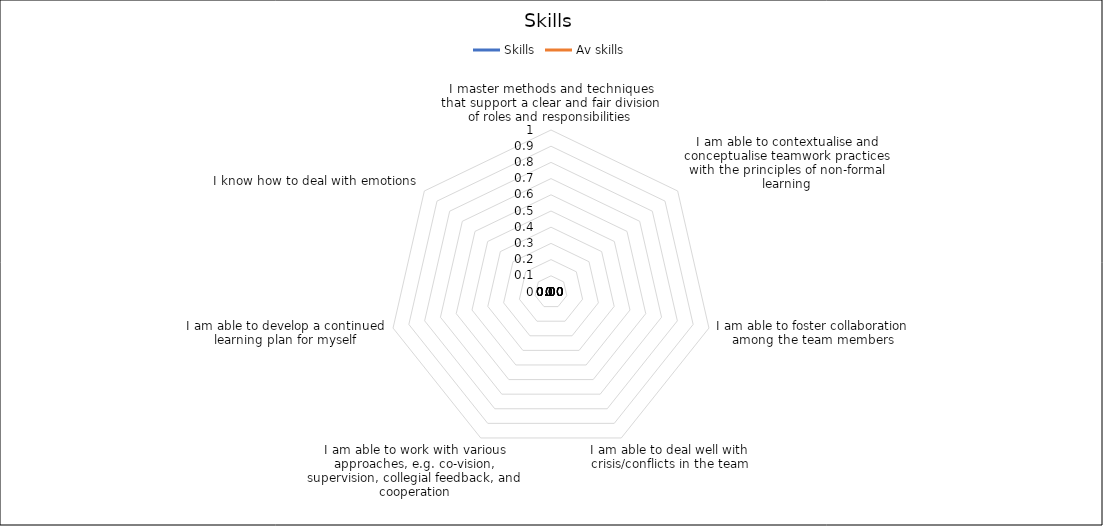
| Category | Skills | Av skills |
|---|---|---|
| I master methods and techniques that support a clear and fair division of roles and responsibilities | 0 | 0 |
| I am able to contextualise and conceptualise teamwork practices with the principles of non-formal learning | 0 | 0 |
| I am able to foster collaboration among the team members | 0 | 0 |
| I am able to deal well with crisis/conflicts in the team | 0 | 0 |
| I am able to work with various approaches, e.g. co-vision, supervision, collegial feedback, and cooperation | 0 | 0 |
| I am able to develop a continued learning plan for myself | 0 | 0 |
| I know how to deal with emotions | 0 | 0 |